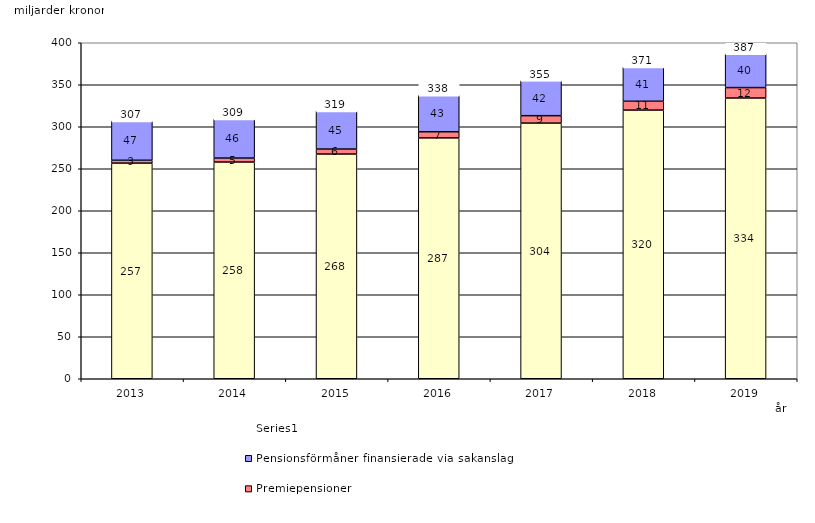
| Category | Inkomstpension och tilläggspension m.m. | Premiepensioner | Pensionsförmåner finansierade via sakanslag | Series 0 |
|---|---|---|---|---|
| 2013.0 | 256.702 | 3.406 | 46.818 | 20 |
| 2014.0 | 257.988 | 4.739 | 46.4 | 20 |
| 2015.0 | 267.52 | 5.918 | 45.359 | 20 |
| 2016.0 | 286.725 | 7.336 | 43.463 | 20 |
| 2017.0 | 304.37 | 8.811 | 41.751 | 20 |
| 2018.0 | 319.84 | 10.51 | 40.798 | 20 |
| 2019.0 | 334.225 | 12.396 | 40.405 | 20 |